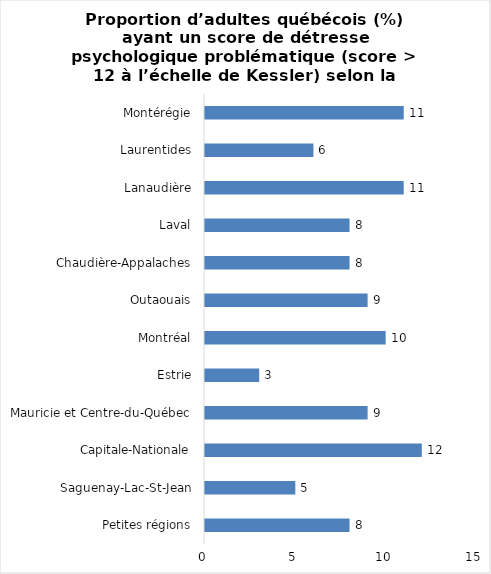
| Category | Series 0 |
|---|---|
| Petites régions | 8 |
| Saguenay-Lac-St-Jean | 5 |
| Capitale-Nationale | 12 |
| Mauricie et Centre-du-Québec | 9 |
| Estrie | 3 |
| Montréal | 10 |
| Outaouais | 9 |
| Chaudière-Appalaches | 8 |
| Laval | 8 |
| Lanaudière | 11 |
| Laurentides | 6 |
| Montérégie | 11 |